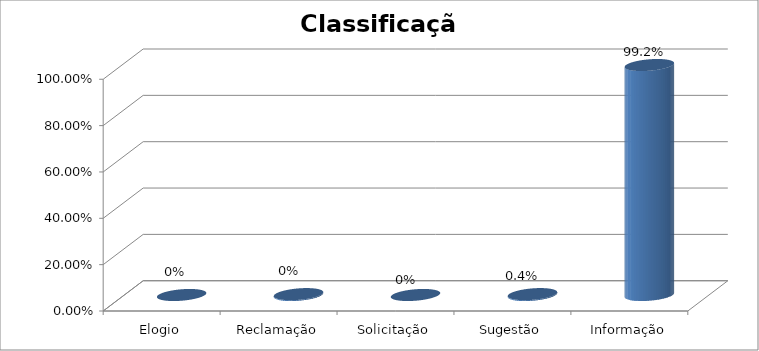
| Category | Series 0 |
|---|---|
| Elogio | 0 |
| Reclamação | 0.004 |
| Solicitação | 0 |
| Sugestão | 0.004 |
| Informação | 0.992 |